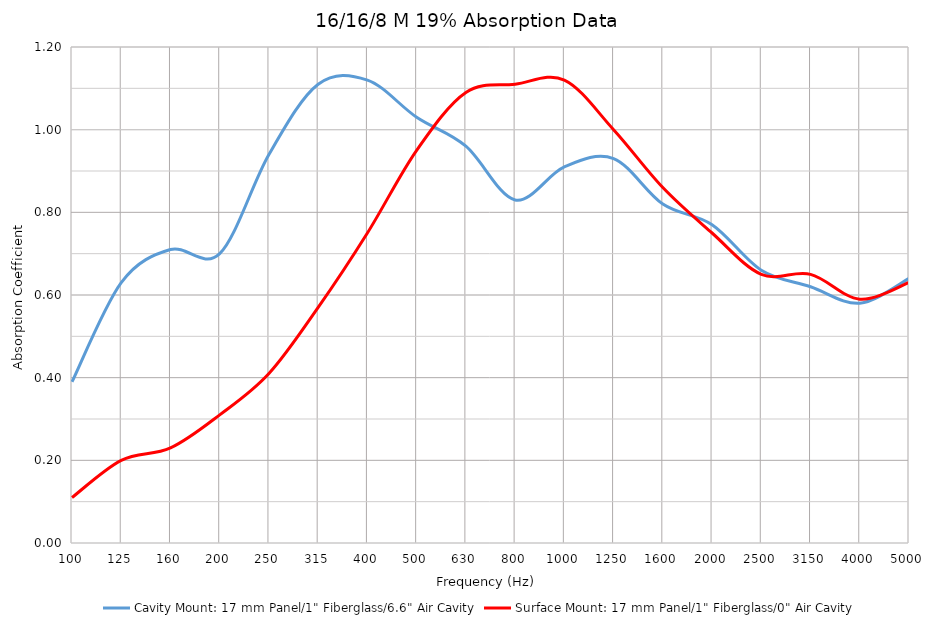
| Category | Cavity Mount: 17 mm Panel/1" Fiberglass/6.6" Air Cavity | Surface Mount: 17 mm Panel/1" Fiberglass/0" Air Cavity |
|---|---|---|
| 100.0 | 0.39 | 0.11 |
| 125.0 | 0.63 | 0.2 |
| 160.0 | 0.71 | 0.23 |
| 200.0 | 0.7 | 0.31 |
| 250.0 | 0.94 | 0.41 |
| 315.0 | 1.11 | 0.57 |
| 400.0 | 1.12 | 0.75 |
| 500.0 | 1.03 | 0.95 |
| 630.0 | 0.96 | 1.09 |
| 800.0 | 0.83 | 1.11 |
| 1000.0 | 0.91 | 1.12 |
| 1250.0 | 0.93 | 1 |
| 1600.0 | 0.82 | 0.86 |
| 2000.0 | 0.77 | 0.75 |
| 2500.0 | 0.66 | 0.65 |
| 3150.0 | 0.62 | 0.65 |
| 4000.0 | 0.58 | 0.59 |
| 5000.0 | 0.64 | 0.63 |